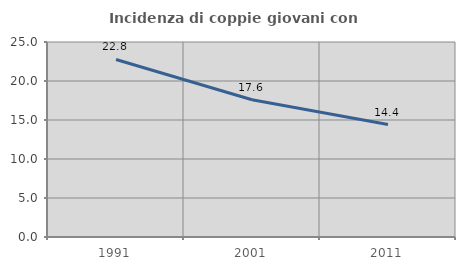
| Category | Incidenza di coppie giovani con figli |
|---|---|
| 1991.0 | 22.762 |
| 2001.0 | 17.602 |
| 2011.0 | 14.416 |